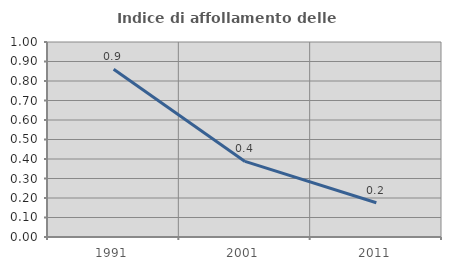
| Category | Indice di affollamento delle abitazioni  |
|---|---|
| 1991.0 | 0.86 |
| 2001.0 | 0.388 |
| 2011.0 | 0.175 |